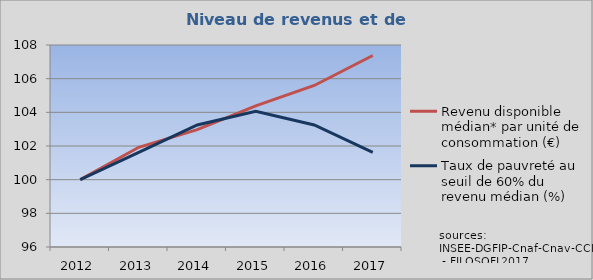
| Category | Revenu disponible médian* par unité de consommation (€) | Taux de pauvreté au seuil de 60% du revenu médian (%) |
|---|---|---|
| 2012.0 | 100 | 100 |
| 2013.0 | 101.922 | 101.626 |
| 2014.0 | 102.97 | 103.252 |
| 2015.0 | 104.381 | 104.065 |
| 2016.0 | 105.595 | 103.252 |
| 2017.0 | 107.375 | 101.626 |